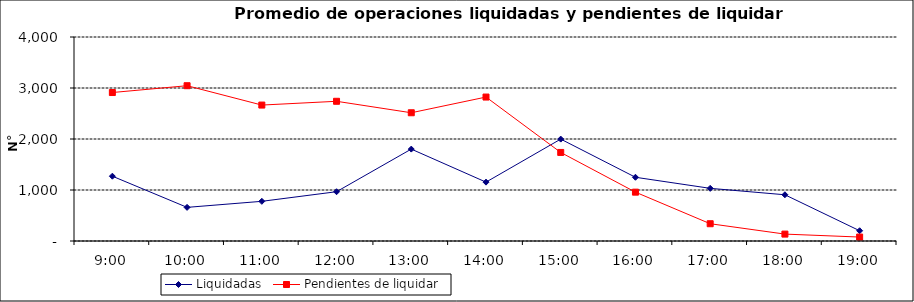
| Category | Liquidadas | Pendientes de liquidar |
|---|---|---|
| 0.375 | 1270.571 | 2911.286 |
| 0.4166666666666667 | 659.571 | 3044.81 |
| 0.4583333333333333 | 778.143 | 2665.333 |
| 0.5 | 966.333 | 2739.524 |
| 0.5416666666666666 | 1801.905 | 2514.619 |
| 0.5833333333333334 | 1154.19 | 2822.476 |
| 0.625 | 1997.905 | 1736.238 |
| 0.6666666666666666 | 1249.619 | 957.762 |
| 0.7083333333333334 | 1032.762 | 338.667 |
| 0.75 | 906.524 | 135.381 |
| 0.7916666666666666 | 201.095 | 77.238 |